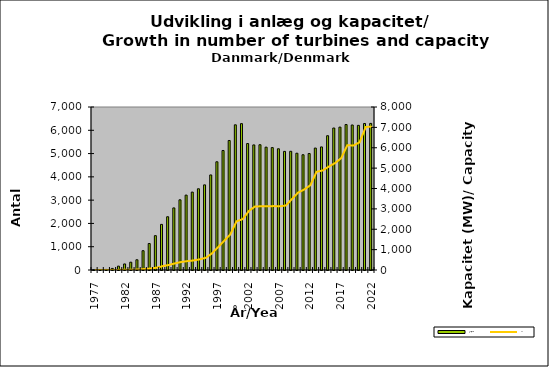
| Category | Antal/No |
|---|---|
| 1977.0 | 2 |
| 1978.0 | 13 |
| 1979.0 | 23 |
| 1980.0 | 68 |
| 1981.0 | 166 |
| 1982.0 | 260 |
| 1983.0 | 335 |
| 1984.0 | 440 |
| 1985.0 | 829 |
| 1986.0 | 1137 |
| 1987.0 | 1475 |
| 1988.0 | 1959 |
| 1989.0 | 2287 |
| 1990.0 | 2666 |
| 1991.0 | 3014 |
| 1992.0 | 3216 |
| 1993.0 | 3345 |
| 1994.0 | 3488 |
| 1995.0 | 3656 |
| 1996.0 | 4082 |
| 1997.0 | 4648 |
| 1998.0 | 5132 |
| 1999.0 | 5562 |
| 2000.0 | 6235 |
| 2001.0 | 6286 |
| 2002.0 | 5431 |
| 2003.0 | 5372 |
| 2004.0 | 5380 |
| 2005.0 | 5275 |
| 2006.0 | 5257 |
| 2007.0 | 5206 |
| 2008.0 | 5094 |
| 2009.0 | 5098 |
| 2010.0 | 5015 |
| 2011.0 | 4950 |
| 2012.0 | 5002 |
| 2013.0 | 5236 |
| 2014.0 | 5285 |
| 2015.0 | 5767 |
| 2016.0 | 6097 |
| 2017.0 | 6136 |
| 2018.0 | 6247 |
| 2019.0 | 6227 |
| 2020.0 | 6212 |
| 2021.0 | 6291 |
| 2022.0 | 6296 |